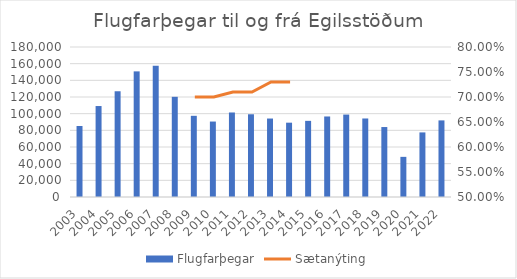
| Category | Flugfarþegar |
|---|---|
| 2003.0 | 85231 |
| 2004.0 | 109159 |
| 2005.0 | 126895 |
| 2006.0 | 150748 |
| 2007.0 | 157643 |
| 2008.0 | 120223 |
| 2009.0 | 97422 |
| 2010.0 | 90543 |
| 2011.0 | 101424 |
| 2012.0 | 99278 |
| 2013.0 | 94162 |
| 2014.0 | 89186 |
| 2015.0 | 91373 |
| 2016.0 | 96629 |
| 2017.0 | 98909 |
| 2018.0 | 94225 |
| 2019.0 | 83954 |
| 2020.0 | 48173 |
| 2021.0 | 77506 |
| 2022.0 | 91919 |